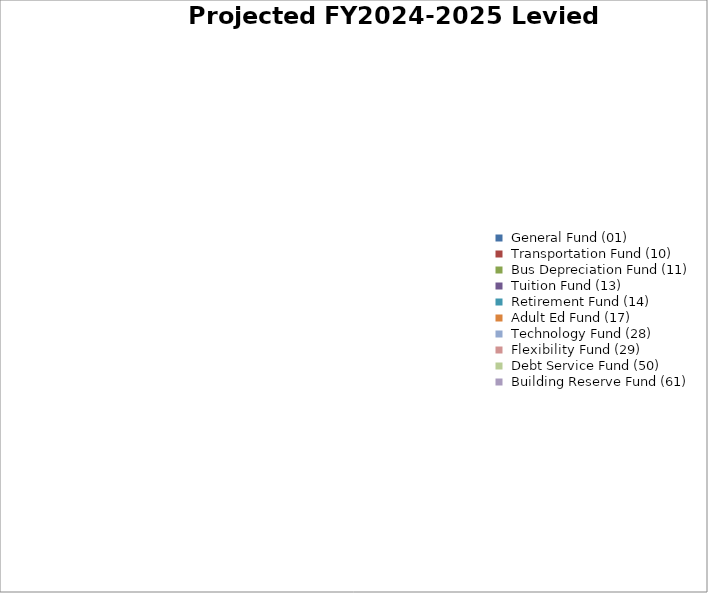
| Category |    |
|---|---|
|  General Fund (01)  | 0 |
|  Transportation Fund (10)  | 0 |
|  Bus Depreciation Fund (11)  | 0 |
|  Tuition Fund (13)  | 0 |
|  Retirement Fund (14)  | 0 |
|  Adult Ed Fund (17)  | 0 |
|  Technology Fund (28)  | 0 |
|  Flexibility Fund (29)  | 0 |
|  Debt Service Fund (50)   | 0 |
|  Building Reserve Fund (61)  | 0 |